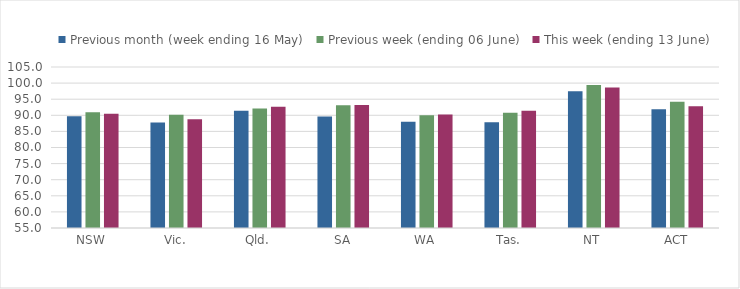
| Category | Previous month (week ending 16 May) | Previous week (ending 06 June) | This week (ending 13 June) |
|---|---|---|---|
| NSW | 89.692 | 90.97 | 90.502 |
| Vic. | 87.793 | 90.203 | 88.766 |
| Qld. | 91.435 | 92.103 | 92.688 |
| SA | 89.597 | 93.101 | 93.231 |
| WA | 88.031 | 89.998 | 90.251 |
| Tas. | 87.823 | 90.826 | 91.398 |
| NT | 97.498 | 99.396 | 98.656 |
| ACT | 91.859 | 94.192 | 92.785 |